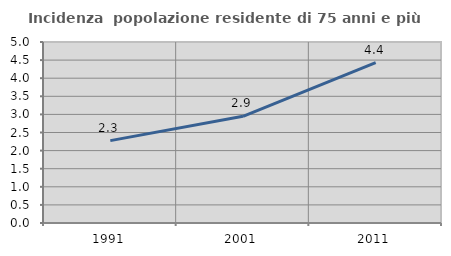
| Category | Incidenza  popolazione residente di 75 anni e più |
|---|---|
| 1991.0 | 2.276 |
| 2001.0 | 2.948 |
| 2011.0 | 4.428 |